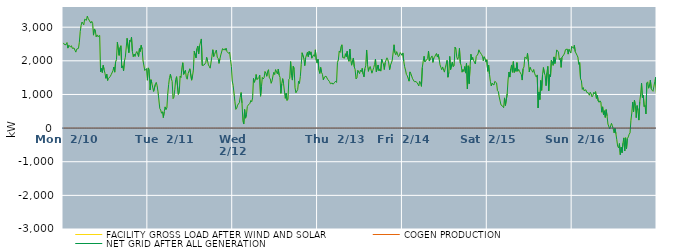
| Category | FACILITY GROSS LOAD AFTER WIND AND SOLAR | COGEN PRODUCTION | NET GRID AFTER ALL GENERATION |
|---|---|---|---|
|  Mon  2/10 | 2532 | 0 | 2532 |
|  Mon  2/10 | 2485 | 0 | 2485 |
|  Mon  2/10 | 2480 | 0 | 2480 |
|  Mon  2/10 | 2478 | 0 | 2478 |
|  Mon  2/10 | 2543 | 0 | 2543 |
|  Mon  2/10 | 2378 | 0 | 2378 |
|  Mon  2/10 | 2459 | 0 | 2459 |
|  Mon  2/10 | 2437 | 0 | 2437 |
|  Mon  2/10 | 2416 | 0 | 2416 |
|  Mon  2/10 | 2449 | 0 | 2449 |
|  Mon  2/10 | 2371 | 0 | 2371 |
|  Mon  2/10 | 2350 | 0 | 2350 |
|  Mon  2/10 | 2380 | 0 | 2380 |
|  Mon  2/10 | 2317 | 0 | 2317 |
|  Mon  2/10 | 2258 | 0 | 2258 |
|  Mon  2/10 | 2348 | 0 | 2348 |
|  Mon  2/10 | 2350 | 0 | 2350 |
|  Mon  2/10 | 2370 | 0 | 2370 |
|  Mon  2/10 | 2553 | 0 | 2553 |
|  Mon  2/10 | 2875 | 0 | 2875 |
|  Mon  2/10 | 3052 | 0 | 3052 |
|  Mon  2/10 | 3154 | 0 | 3154 |
|  Mon  2/10 | 3109 | 0 | 3109 |
|  Mon  2/10 | 3070 | 0 | 3070 |
|  Mon  2/10 | 3235 | 0 | 3235 |
|  Mon  2/10 | 3254 | 0 | 3254 |
|  Mon  2/10 | 3206 | 0 | 3206 |
|  Mon  2/10 | 3329 | 0 | 3329 |
|  Mon  2/10 | 3259 | 0 | 3259 |
|  Mon  2/10 | 3211 | 0 | 3211 |
|  Mon  2/10 | 3209 | 0 | 3209 |
|  Mon  2/10 | 3121 | 0 | 3121 |
|  Mon  2/10 | 3173 | 0 | 3173 |
|  Mon  2/10 | 3117 | 0 | 3117 |
|  Mon  2/10 | 2763 | 0 | 2763 |
|  Mon  2/10 | 2947 | 0 | 2947 |
|  Mon  2/10 | 2916 | 0 | 2916 |
|  Mon  2/10 | 2712 | 0 | 2712 |
|  Mon  2/10 | 2771 | 0 | 2771 |
|  Mon  2/10 | 2718 | 0 | 2718 |
|  Mon  2/10 | 2710 | 0 | 2710 |
|  Mon  2/10 | 2754 | 0 | 2754 |
|  Mon  2/10 | 1672 | 0 | 1672 |
|  Mon  2/10 | 1772 | 0 | 1772 |
|  Mon  2/10 | 1653 | 0 | 1653 |
|  Mon  2/10 | 1866 | 0 | 1866 |
|  Mon  2/10 | 1736 | 0 | 1736 |
|  Mon  2/10 | 1627 | 0 | 1627 |
|  Mon  2/10 | 1480 | 0 | 1480 |
|  Mon  2/10 | 1601 | 0 | 1601 |
|  Mon  2/10 | 1414 | 0 | 1414 |
|  Mon  2/10 | 1475 | 0 | 1475 |
|  Mon  2/10 | 1494 | 0 | 1494 |
|  Mon  2/10 | 1537 | 0 | 1537 |
|  Mon  2/10 | 1589 | 0 | 1589 |
|  Mon  2/10 | 1574 | 0 | 1574 |
|  Mon  2/10 | 1704 | 0 | 1704 |
|  Mon  2/10 | 1816 | 0 | 1816 |
|  Mon  2/10 | 1663 | 0 | 1663 |
|  Mon  2/10 | 1968 | 0 | 1968 |
|  Mon  2/10 | 2035 | 0 | 2035 |
|  Mon  2/10 | 2553 | 0 | 2553 |
|  Mon  2/10 | 2544 | 0 | 2544 |
|  Mon  2/10 | 2162 | 0 | 2162 |
|  Mon  2/10 | 2390 | 0 | 2390 |
|  Mon  2/10 | 2448 | 0 | 2448 |
|  Mon  2/10 | 1791 | 0 | 1791 |
|  Mon  2/10 | 1850 | 0 | 1850 |
|  Mon  2/10 | 1701 | 0 | 1701 |
|  Mon  2/10 | 1991 | 0 | 1991 |
|  Mon  2/10 | 2106 | 0 | 2106 |
|  Mon  2/10 | 2119 | 0 | 2119 |
|  Mon  2/10 | 2669 | 0 | 2669 |
|  Mon  2/10 | 2683 | 0 | 2683 |
|  Mon  2/10 | 2243 | 0 | 2243 |
|  Mon  2/10 | 2612 | 0 | 2612 |
|  Mon  2/10 | 2575 | 0 | 2575 |
|  Mon  2/10 | 2704 | 0 | 2704 |
|  Mon  2/10 | 2278 | 0 | 2278 |
|  Mon  2/10 | 2125 | 0 | 2125 |
|  Mon  2/10 | 2199 | 0 | 2199 |
|  Mon  2/10 | 2128 | 0 | 2128 |
|  Mon  2/10 | 2227 | 0 | 2227 |
|  Mon  2/10 | 2277 | 0 | 2277 |
|  Mon  2/10 | 2299 | 0 | 2299 |
|  Mon  2/10 | 2128 | 0 | 2128 |
|  Mon  2/10 | 2364 | 0 | 2364 |
|  Mon  2/10 | 2280 | 0 | 2280 |
|  Mon  2/10 | 2461 | 0 | 2461 |
|  Mon  2/10 | 2346 | 0 | 2346 |
|  Mon  2/10 | 2011 | 0 | 2011 |
|  Mon  2/10 | 2020 | 0 | 2020 |
|  Mon  2/10 | 1711 | 0 | 1711 |
|  Mon  2/10 | 1724 | 0 | 1724 |
|  Mon  2/10 | 1768 | 0 | 1768 |
|  Mon  2/10 | 1424 | 0 | 1424 |
|  Tue  2/11 | 1790 | 0 | 1790 |
|  Tue  2/11 | 1741 | 0 | 1741 |
|  Tue  2/11 | 1133 | 0 | 1133 |
|  Tue  2/11 | 1439 | 0 | 1439 |
|  Tue  2/11 | 1332 | 0 | 1332 |
|  Tue  2/11 | 1329 | 0 | 1329 |
|  Tue  2/11 | 1091 | 0 | 1091 |
|  Tue  2/11 | 1103 | 0 | 1103 |
|  Tue  2/11 | 1301 | 0 | 1301 |
|  Tue  2/11 | 1359 | 0 | 1359 |
|  Tue  2/11 | 1260 | 0 | 1260 |
|  Tue  2/11 | 1079 | 0 | 1079 |
|  Tue  2/11 | 1055 | 0 | 1055 |
|  Tue  2/11 | 581 | 0 | 581 |
|  Tue  2/11 | 538 | 0 | 538 |
|  Tue  2/11 | 442 | 0 | 442 |
|  Tue  2/11 | 487 | 0 | 487 |
|  Tue  2/11 | 312 | 0 | 312 |
|  Tue  2/11 | 480 | 0 | 480 |
|  Tue  2/11 | 630 | 0 | 630 |
|  Tue  2/11 | 551 | 0 | 551 |
|  Tue  2/11 | 598 | 0 | 598 |
|  Tue  2/11 | 1014 | 0 | 1014 |
|  Tue  2/11 | 1291 | 0 | 1291 |
|  Tue  2/11 | 1502 | 0 | 1502 |
|  Tue  2/11 | 1600 | 0 | 1600 |
|  Tue  2/11 | 1474 | 0 | 1474 |
|  Tue  2/11 | 1387 | 0 | 1387 |
|  Tue  2/11 | 875 | 0 | 875 |
|  Tue  2/11 | 920 | 0 | 920 |
|  Tue  2/11 | 1157 | 0 | 1157 |
|  Tue  2/11 | 1448 | 0 | 1448 |
|  Tue  2/11 | 1529 | 0 | 1529 |
|  Tue  2/11 | 1507 | 0 | 1507 |
|  Tue  2/11 | 1002 | 0 | 1002 |
|  Tue  2/11 | 1049 | 0 | 1049 |
|  Tue  2/11 | 1549 | 0 | 1549 |
|  Tue  2/11 | 1502 | 0 | 1502 |
|  Tue  2/11 | 1788 | 0 | 1788 |
|  Tue  2/11 | 1943 | 0 | 1943 |
|  Tue  2/11 | 1597 | 0 | 1597 |
|  Tue  2/11 | 1626 | 0 | 1626 |
|  Tue  2/11 | 1719 | 0 | 1719 |
|  Tue  2/11 | 1512 | 0 | 1512 |
|  Tue  2/11 | 1453 | 0 | 1453 |
|  Tue  2/11 | 1620 | 0 | 1620 |
|  Tue  2/11 | 1609 | 0 | 1609 |
|  Tue  2/11 | 1763 | 0 | 1763 |
|  Tue  2/11 | 1750 | 0 | 1750 |
|  Tue  2/11 | 1425 | 0 | 1425 |
|  Tue  2/11 | 1544 | 0 | 1544 |
|  Tue  2/11 | 1723 | 0 | 1723 |
|  Tue  2/11 | 2285 | 0 | 2285 |
|  Tue  2/11 | 2307 | 0 | 2307 |
|  Tue  2/11 | 2089 | 0 | 2089 |
|  Tue  2/11 | 2361 | 0 | 2361 |
|  Tue  2/11 | 2440 | 0 | 2440 |
|  Tue  2/11 | 2209 | 0 | 2209 |
|  Tue  2/11 | 2443 | 0 | 2443 |
|  Tue  2/11 | 2469 | 0 | 2469 |
|  Tue  2/11 | 2650 | 0 | 2650 |
|  Tue  2/11 | 1863 | 0 | 1863 |
|  Tue  2/11 | 1861 | 0 | 1861 |
|  Tue  2/11 | 1873 | 0 | 1873 |
|  Tue  2/11 | 1889 | 0 | 1889 |
|  Tue  2/11 | 1942 | 0 | 1942 |
|  Tue  2/11 | 2104 | 0 | 2104 |
|  Tue  2/11 | 2003 | 0 | 2003 |
|  Tue  2/11 | 1877 | 0 | 1877 |
|  Tue  2/11 | 1834 | 0 | 1834 |
|  Tue  2/11 | 1781 | 0 | 1781 |
|  Tue  2/11 | 1792 | 0 | 1792 |
|  Tue  2/11 | 2138 | 0 | 2138 |
|  Tue  2/11 | 2329 | 0 | 2329 |
|  Tue  2/11 | 2126 | 0 | 2126 |
|  Tue  2/11 | 2188 | 0 | 2188 |
|  Tue  2/11 | 2266 | 0 | 2266 |
|  Tue  2/11 | 2321 | 0 | 2321 |
|  Tue  2/11 | 2108 | 0 | 2108 |
|  Tue  2/11 | 2071 | 0 | 2071 |
|  Tue  2/11 | 1924 | 0 | 1924 |
|  Tue  2/11 | 2060 | 0 | 2060 |
|  Tue  2/11 | 2175 | 0 | 2175 |
|  Tue  2/11 | 2190 | 0 | 2190 |
|  Tue  2/11 | 2363 | 0 | 2363 |
|  Tue  2/11 | 2319 | 0 | 2319 |
|  Tue  2/11 | 2357 | 0 | 2357 |
|  Tue  2/11 | 2315 | 0 | 2315 |
|  Tue  2/11 | 2379 | 0 | 2379 |
|  Tue  2/11 | 2277 | 0 | 2277 |
|  Tue  2/11 | 2274 | 0 | 2274 |
|  Tue  2/11 | 2220 | 0 | 2220 |
|  Tue  2/11 | 2258 | 0 | 2258 |
|  Tue  2/11 | 2036 | 0 | 2036 |
|  Tue  2/11 | 1836 | 0 | 1836 |
|  Tue  2/11 | 1400 | 0 | 1400 |
|  Wed  2/12 | 1266 | 0 | 1266 |
|  Wed  2/12 | 1241 | 0 | 1241 |
|  Wed  2/12 | 782 | 0 | 782 |
|  Wed  2/12 | 557 | 0 | 557 |
|  Wed  2/12 | 590 | 0 | 590 |
|  Wed  2/12 | 683 | 0 | 683 |
|  Wed  2/12 | 705 | 0 | 705 |
|  Wed  2/12 | 755 | 0 | 755 |
|  Wed  2/12 | 916 | 0 | 916 |
|  Wed  2/12 | 1056 | 0 | 1056 |
|  Wed  2/12 | 750 | 0 | 750 |
|  Wed  2/12 | 217 | 0 | 217 |
|  Wed  2/12 | 121 | 0 | 121 |
|  Wed  2/12 | 552 | 0 | 552 |
|  Wed  2/12 | 295 | 0 | 295 |
|  Wed  2/12 | 391 | 0 | 391 |
|  Wed  2/12 | 639 | 0 | 639 |
|  Wed  2/12 | 683 | 0 | 683 |
|  Wed  2/12 | 697 | 0 | 697 |
|  Wed  2/12 | 737 | 0 | 737 |
|  Wed  2/12 | 821 | 0 | 821 |
|  Wed  2/12 | 784 | 0 | 784 |
|  Wed  2/12 | 896 | 0 | 896 |
|  Wed  2/12 | 1476 | 0 | 1476 |
|  Wed  2/12 | 1360 | 0 | 1360 |
|  Wed  2/12 | 1427 | 0 | 1427 |
|  Wed  2/12 | 1592 | 0 | 1592 |
|  Wed  2/12 | 1444 | 0 | 1444 |
|  Wed  2/12 | 1432 | 0 | 1432 |
|  Wed  2/12 | 1497 | 0 | 1497 |
|  Wed  2/12 | 1577 | 0 | 1577 |
|  Wed  2/12 | 948 | 0 | 948 |
|  Wed  2/12 | 1228 | 0 | 1228 |
|  Wed  2/12 | 1506 | 0 | 1506 |
|  Wed  2/12 | 1460 | 0 | 1460 |
|  Wed  2/12 | 1499 | 0 | 1499 |
|  Wed  2/12 | 1683 | 0 | 1683 |
|  Wed  2/12 | 1631 | 0 | 1631 |
|  Wed  2/12 | 1541 | 0 | 1541 |
|  Wed  2/12 | 1682 | 0 | 1682 |
|  Wed  2/12 | 1737 | 0 | 1737 |
|  Wed  2/12 | 1492 | 0 | 1492 |
|  Wed  2/12 | 1462 | 0 | 1462 |
|  Wed  2/12 | 1331 | 0 | 1331 |
|  Wed  2/12 | 1403 | 0 | 1403 |
|  Wed  2/12 | 1546 | 0 | 1546 |
|  Wed  2/12 | 1661 | 0 | 1661 |
|  Wed  2/12 | 1590 | 0 | 1590 |
|  Wed  2/12 | 1740 | 0 | 1740 |
|  Wed  2/12 | 1756 | 0 | 1756 |
|  Wed  2/12 | 1610 | 0 | 1610 |
|  Wed  2/12 | 1754 | 0 | 1754 |
|  Wed  2/12 | 1577 | 0 | 1577 |
|  Wed  2/12 | 1509 | 0 | 1509 |
|  Wed  2/12 | 1033 | 0 | 1033 |
|  Wed  2/12 | 1320 | 0 | 1320 |
|  Wed  2/12 | 1470 | 0 | 1470 |
|  Wed  2/12 | 1321 | 0 | 1321 |
|  Wed  2/12 | 1324 | 0 | 1324 |
|  Wed  2/12 | 885 | 0 | 885 |
|  Wed  2/12 | 1040 | 0 | 1040 |
|  Wed  2/12 | 823 | 0 | 823 |
|  Wed  2/12 | 859 | 0 | 859 |
|  Wed  2/12 | 1447 | 0 | 1447 |
|  Wed  2/12 | 1480 | 0 | 1480 |
|  Wed  2/12 | 1975 | 0 | 1975 |
|  Wed  2/12 | 1561 | 0 | 1561 |
|  Wed  2/12 | 1427 | 0 | 1427 |
|  Wed  2/12 | 1835 | 0 | 1835 |
|  Wed  2/12 | 1772 | 0 | 1772 |
|  Wed  2/12 | 1198 | 0 | 1198 |
|  Wed  2/12 | 1050 | 0 | 1050 |
|  Wed  2/12 | 1072 | 0 | 1072 |
|  Wed  2/12 | 1143 | 0 | 1143 |
|  Wed  2/12 | 1390 | 0 | 1390 |
|  Wed  2/12 | 1328 | 0 | 1328 |
|  Wed  2/12 | 1533 | 0 | 1533 |
|  Wed  2/12 | 1886 | 0 | 1886 |
|  Wed  2/12 | 2239 | 0 | 2239 |
|  Wed  2/12 | 2255 | 0 | 2255 |
|  Wed  2/12 | 2066 | 0 | 2066 |
|  Wed  2/12 | 1857 | 0 | 1857 |
|  Wed  2/12 | 2094 | 0 | 2094 |
|  Wed  2/12 | 2091 | 0 | 2091 |
|  Wed  2/12 | 2253 | 0 | 2253 |
|  Wed  2/12 | 2125 | 0 | 2125 |
|  Wed  2/12 | 2282 | 0 | 2282 |
|  Wed  2/12 | 2185 | 0 | 2185 |
|  Wed  2/12 | 2267 | 0 | 2267 |
|  Wed  2/12 | 2078 | 0 | 2078 |
|  Wed  2/12 | 2095 | 0 | 2095 |
|  Wed  2/12 | 2179 | 0 | 2179 |
|  Wed  2/12 | 2131 | 0 | 2131 |
|  Wed  2/12 | 2327 | 0 | 2327 |
|  Wed  2/12 | 2022 | 0 | 2022 |
|  Wed  2/12 | 1933 | 0 | 1933 |
|  Thu  2/13 | 2048 | 0 | 2048 |
|  Thu  2/13 | 1730 | 0 | 1730 |
|  Thu  2/13 | 1625 | 0 | 1625 |
|  Thu  2/13 | 1804 | 0 | 1804 |
|  Thu  2/13 | 1654 | 0 | 1654 |
|  Thu  2/13 | 1599 | 0 | 1599 |
|  Thu  2/13 | 1435 | 0 | 1435 |
|  Thu  2/13 | 1510 | 0 | 1510 |
|  Thu  2/13 | 1525 | 0 | 1525 |
|  Thu  2/13 | 1546 | 0 | 1546 |
|  Thu  2/13 | 1557 | 0 | 1557 |
|  Thu  2/13 | 1447 | 0 | 1447 |
|  Thu  2/13 | 1435 | 0 | 1435 |
|  Thu  2/13 | 1381 | 0 | 1381 |
|  Thu  2/13 | 1318 | 0 | 1318 |
|  Thu  2/13 | 1321 | 0 | 1321 |
|  Thu  2/13 | 1341 | 0 | 1341 |
|  Thu  2/13 | 1304 | 0 | 1304 |
|  Thu  2/13 | 1327 | 0 | 1327 |
|  Thu  2/13 | 1364 | 0 | 1364 |
|  Thu  2/13 | 1397 | 0 | 1397 |
|  Thu  2/13 | 1357 | 0 | 1357 |
|  Thu  2/13 | 1956 | 0 | 1956 |
|  Thu  2/13 | 2024 | 0 | 2024 |
|  Thu  2/13 | 2292 | 0 | 2292 |
|  Thu  2/13 | 2250 | 0 | 2250 |
|  Thu  2/13 | 2418 | 0 | 2418 |
|  Thu  2/13 | 2476 | 0 | 2476 |
|  Thu  2/13 | 2099 | 0 | 2099 |
|  Thu  2/13 | 2111 | 0 | 2111 |
|  Thu  2/13 | 2080 | 0 | 2080 |
|  Thu  2/13 | 2211 | 0 | 2211 |
|  Thu  2/13 | 2123 | 0 | 2123 |
|  Thu  2/13 | 2283 | 0 | 2283 |
|  Thu  2/13 | 2058 | 0 | 2058 |
|  Thu  2/13 | 1985 | 0 | 1985 |
|  Thu  2/13 | 2349 | 0 | 2349 |
|  Thu  2/13 | 2035 | 0 | 2035 |
|  Thu  2/13 | 1870 | 0 | 1870 |
|  Thu  2/13 | 2010 | 0 | 2010 |
|  Thu  2/13 | 2084 | 0 | 2084 |
|  Thu  2/13 | 1822 | 0 | 1822 |
|  Thu  2/13 | 1740 | 0 | 1740 |
|  Thu  2/13 | 1462 | 0 | 1462 |
|  Thu  2/13 | 1494 | 0 | 1494 |
|  Thu  2/13 | 1720 | 0 | 1720 |
|  Thu  2/13 | 1721 | 0 | 1721 |
|  Thu  2/13 | 1619 | 0 | 1619 |
|  Thu  2/13 | 1722 | 0 | 1722 |
|  Thu  2/13 | 1677 | 0 | 1677 |
|  Thu  2/13 | 1776 | 0 | 1776 |
|  Thu  2/13 | 1611 | 0 | 1611 |
|  Thu  2/13 | 1522 | 0 | 1522 |
|  Thu  2/13 | 1765 | 0 | 1765 |
|  Thu  2/13 | 1850 | 0 | 1850 |
|  Thu  2/13 | 2322 | 0 | 2322 |
|  Thu  2/13 | 1889 | 0 | 1889 |
|  Thu  2/13 | 1688 | 0 | 1688 |
|  Thu  2/13 | 1802 | 0 | 1802 |
|  Thu  2/13 | 1832 | 0 | 1832 |
|  Thu  2/13 | 1829 | 0 | 1829 |
|  Thu  2/13 | 1632 | 0 | 1632 |
|  Thu  2/13 | 1719 | 0 | 1719 |
|  Thu  2/13 | 1797 | 0 | 1797 |
|  Thu  2/13 | 1895 | 0 | 1895 |
|  Thu  2/13 | 2054 | 0 | 2054 |
|  Thu  2/13 | 1675 | 0 | 1675 |
|  Thu  2/13 | 1669 | 0 | 1669 |
|  Thu  2/13 | 1876 | 0 | 1876 |
|  Thu  2/13 | 1700 | 0 | 1700 |
|  Thu  2/13 | 1753 | 0 | 1753 |
|  Thu  2/13 | 1694 | 0 | 1694 |
|  Thu  2/13 | 2050 | 0 | 2050 |
|  Thu  2/13 | 1962 | 0 | 1962 |
|  Thu  2/13 | 1908 | 0 | 1908 |
|  Thu  2/13 | 1742 | 0 | 1742 |
|  Thu  2/13 | 1949 | 0 | 1949 |
|  Thu  2/13 | 2022 | 0 | 2022 |
|  Thu  2/13 | 2089 | 0 | 2089 |
|  Thu  2/13 | 2030 | 0 | 2030 |
|  Thu  2/13 | 1936 | 0 | 1936 |
|  Thu  2/13 | 1738 | 0 | 1738 |
|  Thu  2/13 | 1873 | 0 | 1873 |
|  Thu  2/13 | 1937 | 0 | 1937 |
|  Thu  2/13 | 2019 | 0 | 2019 |
|  Thu  2/13 | 2040 | 0 | 2040 |
|  Thu  2/13 | 2476 | 0 | 2476 |
|  Thu  2/13 | 2240 | 0 | 2240 |
|  Thu  2/13 | 2180 | 0 | 2180 |
|  Thu  2/13 | 2274 | 0 | 2274 |
|  Thu  2/13 | 2296 | 0 | 2296 |
|  Thu  2/13 | 2124 | 0 | 2124 |
|  Thu  2/13 | 2156 | 0 | 2156 |
|  Thu  2/13 | 2245 | 0 | 2245 |
|  Thu  2/13 | 2226 | 0 | 2226 |
|  Thu  2/13 | 2164 | 0 | 2164 |
|  Fri  2/14 | 2234 | 0 | 2234 |
|  Fri  2/14 | 1986 | 0 | 1986 |
|  Fri  2/14 | 1825 | 0 | 1825 |
|  Fri  2/14 | 1725 | 0 | 1725 |
|  Fri  2/14 | 1593 | 0 | 1593 |
|  Fri  2/14 | 1555 | 0 | 1555 |
|  Fri  2/14 | 1577 | 0 | 1577 |
|  Fri  2/14 | 1395 | 0 | 1395 |
|  Fri  2/14 | 1671 | 0 | 1671 |
|  Fri  2/14 | 1622 | 0 | 1622 |
|  Fri  2/14 | 1604 | 0 | 1604 |
|  Fri  2/14 | 1466 | 0 | 1466 |
|  Fri  2/14 | 1463 | 0 | 1463 |
|  Fri  2/14 | 1380 | 0 | 1380 |
|  Fri  2/14 | 1374 | 0 | 1374 |
|  Fri  2/14 | 1384 | 0 | 1384 |
|  Fri  2/14 | 1373 | 0 | 1373 |
|  Fri  2/14 | 1310 | 0 | 1310 |
|  Fri  2/14 | 1254 | 0 | 1254 |
|  Fri  2/14 | 1392 | 0 | 1392 |
|  Fri  2/14 | 1343 | 0 | 1343 |
|  Fri  2/14 | 1241 | 0 | 1241 |
|  Fri  2/14 | 1802 | 0 | 1802 |
|  Fri  2/14 | 1987 | 0 | 1987 |
|  Fri  2/14 | 2134 | 0 | 2134 |
|  Fri  2/14 | 1968 | 0 | 1968 |
|  Fri  2/14 | 2001 | 0 | 2001 |
|  Fri  2/14 | 2016 | 0 | 2016 |
|  Fri  2/14 | 2068 | 0 | 2068 |
|  Fri  2/14 | 2290 | 0 | 2290 |
|  Fri  2/14 | 1993 | 0 | 1993 |
|  Fri  2/14 | 2063 | 0 | 2063 |
|  Fri  2/14 | 2035 | 0 | 2035 |
|  Fri  2/14 | 2146 | 0 | 2146 |
|  Fri  2/14 | 1954 | 0 | 1954 |
|  Fri  2/14 | 2084 | 0 | 2084 |
|  Fri  2/14 | 2123 | 0 | 2123 |
|  Fri  2/14 | 2110 | 0 | 2110 |
|  Fri  2/14 | 2219 | 0 | 2219 |
|  Fri  2/14 | 2112 | 0 | 2112 |
|  Fri  2/14 | 2191 | 0 | 2191 |
|  Fri  2/14 | 2058 | 0 | 2058 |
|  Fri  2/14 | 1882 | 0 | 1882 |
|  Fri  2/14 | 1807 | 0 | 1807 |
|  Fri  2/14 | 1734 | 0 | 1734 |
|  Fri  2/14 | 1818 | 0 | 1818 |
|  Fri  2/14 | 1795 | 0 | 1795 |
|  Fri  2/14 | 1664 | 0 | 1664 |
|  Fri  2/14 | 1790 | 0 | 1790 |
|  Fri  2/14 | 1900 | 0 | 1900 |
|  Fri  2/14 | 2011 | 0 | 2011 |
|  Fri  2/14 | 1513 | 0 | 1513 |
|  Fri  2/14 | 1655 | 0 | 1655 |
|  Fri  2/14 | 2130 | 0 | 2130 |
|  Fri  2/14 | 1740 | 0 | 1740 |
|  Fri  2/14 | 1756 | 0 | 1756 |
|  Fri  2/14 | 1960 | 0 | 1960 |
|  Fri  2/14 | 1828 | 0 | 1828 |
|  Fri  2/14 | 1860 | 0 | 1860 |
|  Fri  2/14 | 2404 | 0 | 2404 |
|  Fri  2/14 | 2351 | 0 | 2351 |
|  Fri  2/14 | 2105 | 0 | 2105 |
|  Fri  2/14 | 2043 | 0 | 2043 |
|  Fri  2/14 | 2122 | 0 | 2122 |
|  Fri  2/14 | 2370 | 0 | 2370 |
|  Fri  2/14 | 1933 | 0 | 1933 |
|  Fri  2/14 | 1858 | 0 | 1858 |
|  Fri  2/14 | 1663 | 0 | 1663 |
|  Fri  2/14 | 1742 | 0 | 1742 |
|  Fri  2/14 | 1680 | 0 | 1680 |
|  Fri  2/14 | 1831 | 0 | 1831 |
|  Fri  2/14 | 1635 | 0 | 1635 |
|  Fri  2/14 | 1931 | 0 | 1931 |
|  Fri  2/14 | 1163 | 0 | 1163 |
|  Fri  2/14 | 1852 | 0 | 1852 |
|  Fri  2/14 | 1320 | 0 | 1320 |
|  Fri  2/14 | 1832 | 0 | 1832 |
|  Fri  2/14 | 2196 | 0 | 2196 |
|  Fri  2/14 | 2031 | 0 | 2031 |
|  Fri  2/14 | 2102 | 0 | 2102 |
|  Fri  2/14 | 2013 | 0 | 2013 |
|  Fri  2/14 | 1994 | 0 | 1994 |
|  Fri  2/14 | 1905 | 0 | 1905 |
|  Fri  2/14 | 2129 | 0 | 2129 |
|  Fri  2/14 | 2118 | 0 | 2118 |
|  Fri  2/14 | 2203 | 0 | 2203 |
|  Fri  2/14 | 2327 | 0 | 2327 |
|  Fri  2/14 | 2263 | 0 | 2263 |
|  Fri  2/14 | 2251 | 0 | 2251 |
|  Fri  2/14 | 2188 | 0 | 2188 |
|  Fri  2/14 | 2138 | 0 | 2138 |
|  Fri  2/14 | 2007 | 0 | 2007 |
|  Fri  2/14 | 2121 | 0 | 2121 |
|  Fri  2/14 | 2073 | 0 | 2073 |
|  Fri  2/14 | 1962 | 0 | 1962 |
|  Fri  2/14 | 2033 | 0 | 2033 |
|  Sat  2/15 | 1689 | 0 | 1689 |
|  Sat  2/15 | 1873 | 0 | 1873 |
|  Sat  2/15 | 1598 | 0 | 1598 |
|  Sat  2/15 | 1390 | 0 | 1390 |
|  Sat  2/15 | 1254 | 0 | 1254 |
|  Sat  2/15 | 1332 | 0 | 1332 |
|  Sat  2/15 | 1360 | 0 | 1360 |
|  Sat  2/15 | 1280 | 0 | 1280 |
|  Sat  2/15 | 1389 | 0 | 1389 |
|  Sat  2/15 | 1369 | 0 | 1369 |
|  Sat  2/15 | 1344 | 0 | 1344 |
|  Sat  2/15 | 1115 | 0 | 1115 |
|  Sat  2/15 | 1084 | 0 | 1084 |
|  Sat  2/15 | 926 | 0 | 926 |
|  Sat  2/15 | 913 | 0 | 913 |
|  Sat  2/15 | 689 | 0 | 689 |
|  Sat  2/15 | 676 | 0 | 676 |
|  Sat  2/15 | 648 | 0 | 648 |
|  Sat  2/15 | 607 | 0 | 607 |
|  Sat  2/15 | 898 | 0 | 898 |
|  Sat  2/15 | 670 | 0 | 670 |
|  Sat  2/15 | 698 | 0 | 698 |
|  Sat  2/15 | 1013 | 0 | 1013 |
|  Sat  2/15 | 1430 | 0 | 1430 |
|  Sat  2/15 | 1667 | 0 | 1667 |
|  Sat  2/15 | 1517 | 0 | 1517 |
|  Sat  2/15 | 1760 | 0 | 1760 |
|  Sat  2/15 | 1877 | 0 | 1877 |
|  Sat  2/15 | 1660 | 0 | 1660 |
|  Sat  2/15 | 1975 | 0 | 1975 |
|  Sat  2/15 | 1655 | 0 | 1655 |
|  Sat  2/15 | 1775 | 0 | 1775 |
|  Sat  2/15 | 1687 | 0 | 1687 |
|  Sat  2/15 | 1946 | 0 | 1946 |
|  Sat  2/15 | 1689 | 0 | 1689 |
|  Sat  2/15 | 1743 | 0 | 1743 |
|  Sat  2/15 | 1685 | 0 | 1685 |
|  Sat  2/15 | 1670 | 0 | 1670 |
|  Sat  2/15 | 1593 | 0 | 1593 |
|  Sat  2/15 | 1428 | 0 | 1428 |
|  Sat  2/15 | 1764 | 0 | 1764 |
|  Sat  2/15 | 1818 | 0 | 1818 |
|  Sat  2/15 | 2110 | 0 | 2110 |
|  Sat  2/15 | 2135 | 0 | 2135 |
|  Sat  2/15 | 2066 | 0 | 2066 |
|  Sat  2/15 | 2224 | 0 | 2224 |
|  Sat  2/15 | 1972 | 0 | 1972 |
|  Sat  2/15 | 1671 | 0 | 1671 |
|  Sat  2/15 | 1806 | 0 | 1806 |
|  Sat  2/15 | 1745 | 0 | 1745 |
|  Sat  2/15 | 1705 | 0 | 1705 |
|  Sat  2/15 | 1660 | 0 | 1660 |
|  Sat  2/15 | 1743 | 0 | 1743 |
|  Sat  2/15 | 1633 | 0 | 1633 |
|  Sat  2/15 | 1560 | 0 | 1560 |
|  Sat  2/15 | 1517 | 0 | 1517 |
|  Sat  2/15 | 1580 | 0 | 1580 |
|  Sat  2/15 | 600 | 0 | 600 |
|  Sat  2/15 | 1074 | 0 | 1074 |
|  Sat  2/15 | 848 | 0 | 848 |
|  Sat  2/15 | 1415 | 0 | 1415 |
|  Sat  2/15 | 1122 | 0 | 1122 |
|  Sat  2/15 | 1588 | 0 | 1588 |
|  Sat  2/15 | 1800 | 0 | 1800 |
|  Sat  2/15 | 1642 | 0 | 1642 |
|  Sat  2/15 | 1564 | 0 | 1564 |
|  Sat  2/15 | 1261 | 0 | 1261 |
|  Sat  2/15 | 1652 | 0 | 1652 |
|  Sat  2/15 | 1836 | 0 | 1836 |
|  Sat  2/15 | 1109 | 0 | 1109 |
|  Sat  2/15 | 1586 | 0 | 1586 |
|  Sat  2/15 | 1526 | 0 | 1526 |
|  Sat  2/15 | 2021 | 0 | 2021 |
|  Sat  2/15 | 1980 | 0 | 1980 |
|  Sat  2/15 | 1865 | 0 | 1865 |
|  Sat  2/15 | 2116 | 0 | 2116 |
|  Sat  2/15 | 1920 | 0 | 1920 |
|  Sat  2/15 | 2075 | 0 | 2075 |
|  Sat  2/15 | 2325 | 0 | 2325 |
|  Sat  2/15 | 2313 | 0 | 2313 |
|  Sat  2/15 | 2259 | 0 | 2259 |
|  Sat  2/15 | 2031 | 0 | 2031 |
|  Sat  2/15 | 2079 | 0 | 2079 |
|  Sat  2/15 | 1805 | 0 | 1805 |
|  Sat  2/15 | 2105 | 0 | 2105 |
|  Sat  2/15 | 2095 | 0 | 2095 |
|  Sat  2/15 | 2177 | 0 | 2177 |
|  Sat  2/15 | 2235 | 0 | 2235 |
|  Sat  2/15 | 2334 | 0 | 2334 |
|  Sat  2/15 | 2344 | 0 | 2344 |
|  Sat  2/15 | 2349 | 0 | 2349 |
|  Sat  2/15 | 2199 | 0 | 2199 |
|  Sat  2/15 | 2342 | 0 | 2342 |
|  Sat  2/15 | 2320 | 0 | 2320 |
|  Sat  2/15 | 2231 | 0 | 2231 |
|  Sat  2/15 | 2431 | 0 | 2431 |
|  Sun  2/16 | 2405 | 0 | 2405 |
|  Sun  2/16 | 2370 | 0 | 2370 |
|  Sun  2/16 | 2462 | 0 | 2462 |
|  Sun  2/16 | 2274 | 0 | 2274 |
|  Sun  2/16 | 2259 | 0 | 2259 |
|  Sun  2/16 | 2167 | 0 | 2167 |
|  Sun  2/16 | 2111 | 0 | 2111 |
|  Sun  2/16 | 1893 | 0 | 1893 |
|  Sun  2/16 | 1948 | 0 | 1948 |
|  Sun  2/16 | 1464 | 0 | 1464 |
|  Sun  2/16 | 1405 | 0 | 1405 |
|  Sun  2/16 | 1150 | 0 | 1150 |
|  Sun  2/16 | 1208 | 0 | 1208 |
|  Sun  2/16 | 1112 | 0 | 1112 |
|  Sun  2/16 | 1123 | 0 | 1123 |
|  Sun  2/16 | 1138 | 0 | 1138 |
|  Sun  2/16 | 1063 | 0 | 1063 |
|  Sun  2/16 | 1086 | 0 | 1086 |
|  Sun  2/16 | 1042 | 0 | 1042 |
|  Sun  2/16 | 977 | 0 | 977 |
|  Sun  2/16 | 1066 | 0 | 1066 |
|  Sun  2/16 | 1014 | 0 | 1014 |
|  Sun  2/16 | 927 | 0 | 927 |
|  Sun  2/16 | 971 | 0 | 971 |
|  Sun  2/16 | 1065 | 0 | 1065 |
|  Sun  2/16 | 1019 | 0 | 1019 |
|  Sun  2/16 | 1083 | 0 | 1083 |
|  Sun  2/16 | 884 | 0 | 884 |
|  Sun  2/16 | 974 | 0 | 974 |
|  Sun  2/16 | 804 | 0 | 804 |
|  Sun  2/16 | 766 | 0 | 766 |
|  Sun  2/16 | 811 | 0 | 811 |
|  Sun  2/16 | 777 | 0 | 777 |
|  Sun  2/16 | 472 | 0 | 472 |
|  Sun  2/16 | 632 | 0 | 632 |
|  Sun  2/16 | 398 | 0 | 398 |
|  Sun  2/16 | 515 | 0 | 515 |
|  Sun  2/16 | 318 | 0 | 318 |
|  Sun  2/16 | 549 | 0 | 549 |
|  Sun  2/16 | 364 | 0 | 364 |
|  Sun  2/16 | 120 | 0 | 120 |
|  Sun  2/16 | 92 | 0 | 92 |
|  Sun  2/16 | -24 | 0 | -24 |
|  Sun  2/16 | 3 | 0 | 3 |
|  Sun  2/16 | 142 | 0 | 142 |
|  Sun  2/16 | 69 | 0 | 69 |
|  Sun  2/16 | -25 | 0 | -25 |
|  Sun  2/16 | -140 | 0 | -140 |
|  Sun  2/16 | -7 | 0 | -7 |
|  Sun  2/16 | -165 | 0 | -165 |
|  Sun  2/16 | -348 | 0 | -348 |
|  Sun  2/16 | -539 | 0 | -539 |
|  Sun  2/16 | -587 | 0 | -587 |
|  Sun  2/16 | -459 | 0 | -459 |
|  Sun  2/16 | -789 | 0 | -789 |
|  Sun  2/16 | -567 | 0 | -567 |
|  Sun  2/16 | -732 | 0 | -732 |
|  Sun  2/16 | -448 | 0 | -448 |
|  Sun  2/16 | -291 | 0 | -291 |
|  Sun  2/16 | -677 | 0 | -677 |
|  Sun  2/16 | -288 | 0 | -288 |
|  Sun  2/16 | -613 | 0 | -613 |
|  Sun  2/16 | -313 | 0 | -313 |
|  Sun  2/16 | -263 | 0 | -263 |
|  Sun  2/16 | -183 | 0 | -183 |
|  Sun  2/16 | -141 | 0 | -141 |
|  Sun  2/16 | 234 | 0 | 234 |
|  Sun  2/16 | 450 | 0 | 450 |
|  Sun  2/16 | 775 | 0 | 775 |
|  Sun  2/16 | 488 | 0 | 488 |
|  Sun  2/16 | 830 | 0 | 830 |
|  Sun  2/16 | 667 | 0 | 667 |
|  Sun  2/16 | 311 | 0 | 311 |
|  Sun  2/16 | 669 | 0 | 669 |
|  Sun  2/16 | 523 | 0 | 523 |
|  Sun  2/16 | 238 | 0 | 238 |
|  Sun  2/16 | 785 | 0 | 785 |
|  Sun  2/16 | 1009 | 0 | 1009 |
|  Sun  2/16 | 1336 | 0 | 1336 |
|  Sun  2/16 | 909 | 0 | 909 |
|  Sun  2/16 | 975 | 0 | 975 |
|  Sun  2/16 | 638 | 0 | 638 |
|  Sun  2/16 | 674 | 0 | 674 |
|  Sun  2/16 | 420 | 0 | 420 |
|  Sun  2/16 | 1342 | 0 | 1342 |
|  Sun  2/16 | 1375 | 0 | 1375 |
|  Sun  2/16 | 1186 | 0 | 1186 |
|  Sun  2/16 | 1281 | 0 | 1281 |
|  Sun  2/16 | 1427 | 0 | 1427 |
|  Sun  2/16 | 1172 | 0 | 1172 |
|  Sun  2/16 | 1125 | 0 | 1125 |
|  Sun  2/16 | 1094 | 0 | 1094 |
|  Sun  2/16 | 1105 | 0 | 1105 |
|  Sun  2/16 | 1383 | 0 | 1383 |
|  Sun  2/16 | 1510 | 0 | 1510 |
|  Sun  2/16 | 975 | 0 | 975 |